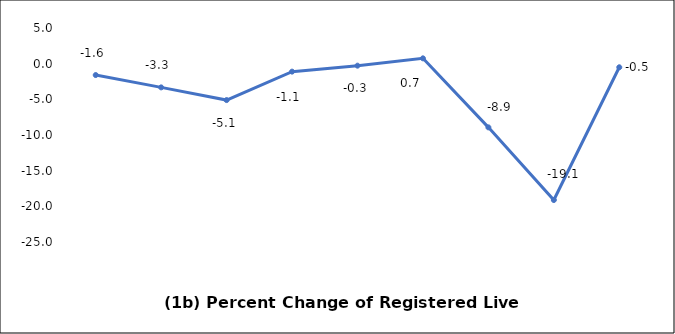
| Category | Series 0 |
|---|---|
| 0 | -1.597 |
| 1 | -3.324 |
| 2 | -5.104 |
| 3 | -1.117 |
| 4 | -0.28 |
| 5 | 0.747 |
| 6 | -8.929 |
| 7 | -19.115 |
| 8 | -0.506 |